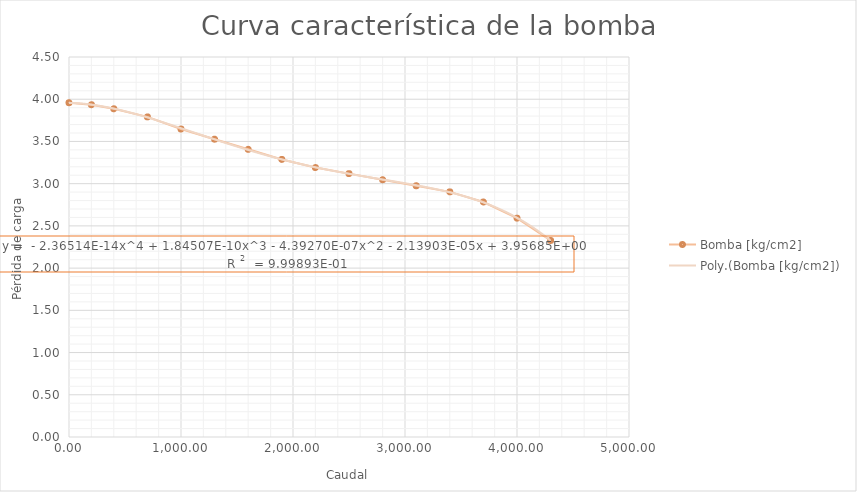
| Category | Bomba |
|---|---|
| 0.0 | 3.959 |
| 200.0 | 3.935 |
| 400.0 | 3.887 |
| 700.0 | 3.791 |
| 1000.0 | 3.647 |
| 1300.0 | 3.527 |
| 1600.0 | 3.407 |
| 1900.0 | 3.287 |
| 2200.0 | 3.191 |
| 2500.0 | 3.119 |
| 2800.0 | 3.047 |
| 3100.0 | 2.975 |
| 3400.0 | 2.903 |
| 3700.0 | 2.783 |
| 4000.0 | 2.591 |
| 4300.0 | 2.327 |